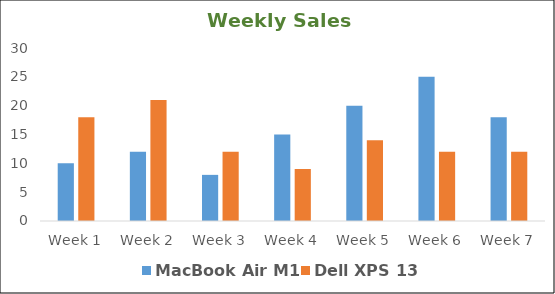
| Category | MacBook Air M1  | Dell XPS 13 |
|---|---|---|
| Week 1 | 10 | 18 |
| Week 2 | 12 | 21 |
| Week 3 | 8 | 12 |
| Week 4 | 15 | 9 |
| Week 5 | 20 | 14 |
| Week 6 | 25 | 12 |
| Week 7 | 18 | 12 |